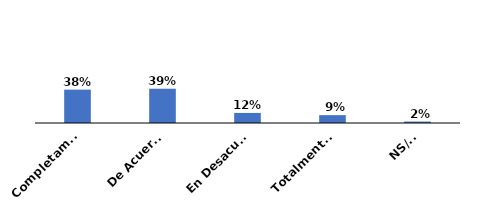
| Category | Series 0 |
|---|---|
| Completamente de acuerdo | 0.383 |
| De Acuerdo | 0.394 |
| En Desacuerdo | 0.116 |
| Totalmente en desacuerdo | 0.09 |
| NS/NR | 0.017 |